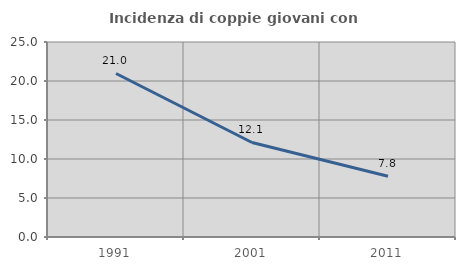
| Category | Incidenza di coppie giovani con figli |
|---|---|
| 1991.0 | 20.965 |
| 2001.0 | 12.116 |
| 2011.0 | 7.788 |